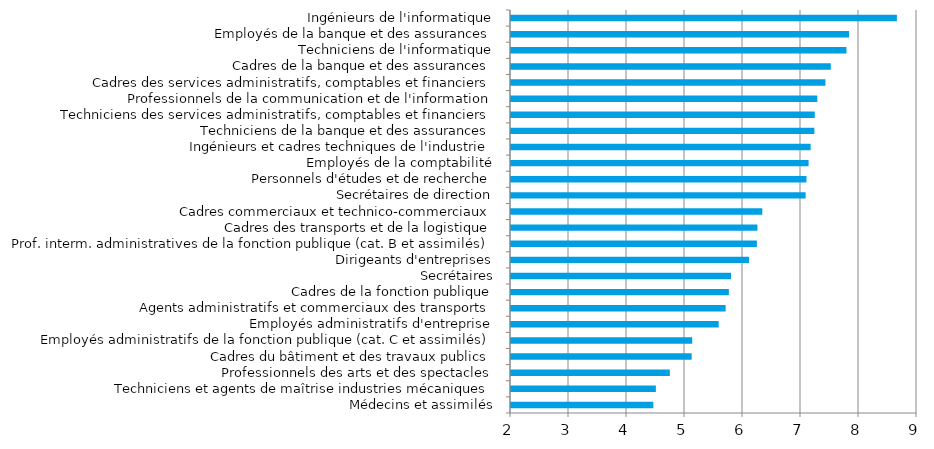
| Category | Series 0 |
|---|---|
| Médecins et assimilés | 4.454 |
| Techniciens et agents de maîtrise industries mécaniques | 4.498 |
| Professionnels des arts et des spectacles | 4.739 |
| Cadres du bâtiment et des travaux publics | 5.115 |
| Employés administratifs de la fonction publique (cat. C et assimilés) | 5.125 |
| Employés administratifs d'entreprise | 5.581 |
| Agents administratifs et commerciaux des transports | 5.701 |
| Cadres de la fonction publique | 5.756 |
| Secrétaires | 5.793 |
| Dirigeants d'entreprises | 6.104 |
| Prof. interm. administratives de la fonction publique (cat. B et assimilés) | 6.239 |
| Cadres des transports et de la logistique | 6.249 |
| Cadres commerciaux et technico-commerciaux | 6.333 |
| Secrétaires de direction | 7.08 |
| Personnels d'études et de recherche | 7.094 |
| Employés de la comptabilité | 7.131 |
| Ingénieurs et cadres techniques de l'industrie | 7.167 |
| Techniciens de la banque et des assurances | 7.23 |
| Techniciens des services administratifs, comptables et financiers | 7.237 |
| Professionnels de la communication et de l'information | 7.281 |
| Cadres des services administratifs, comptables et financiers | 7.421 |
| Cadres de la banque et des assurances | 7.514 |
| Techniciens de l'informatique | 7.784 |
| Employés de la banque et des assurances | 7.829 |
| Ingénieurs de l'informatique | 8.653 |